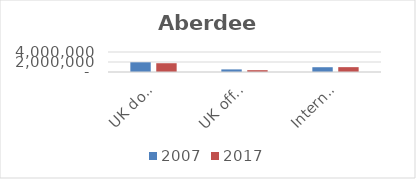
| Category | 2007 | 2017 |
|---|---|---|
| UK domestic | 1936140 | 1754086 |
| UK offshore | 519389 | 364999 |
| International | 956709 | 970659 |